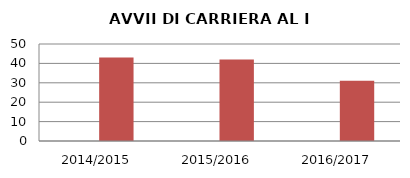
| Category | ANNO | NUMERO |
|---|---|---|
| 2014/2015 | 0 | 43 |
| 2015/2016 | 0 | 42 |
| 2016/2017 | 0 | 31 |